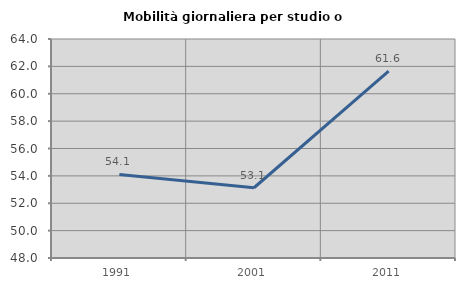
| Category | Mobilità giornaliera per studio o lavoro |
|---|---|
| 1991.0 | 54.109 |
| 2001.0 | 53.133 |
| 2011.0 | 61.647 |